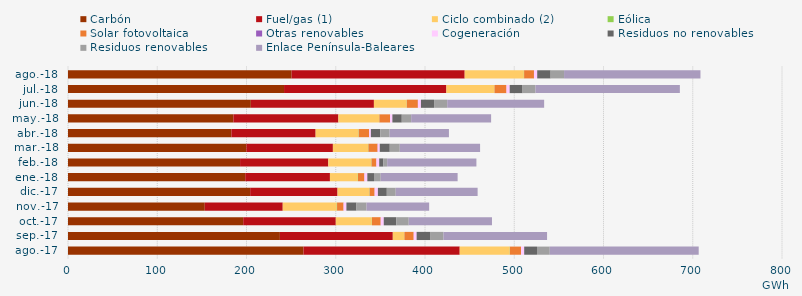
| Category | Carbón | Fuel/gas (1) | Ciclo combinado (2) | Eólica | Solar fotovoltaica | Otras renovables | Cogeneración | Residuos no renovables | Residuos renovables | Enlace Península-Baleares |
|---|---|---|---|---|---|---|---|---|---|---|
| ago.-17 | 263.832 | 175.061 | 56.052 | 0.172 | 12.457 | 0.073 | 3.488 | 14.326 | 14.326 | 166.876 |
| sep.-17 | 237.417 | 126.509 | 12.833 | 0.183 | 10.365 | 0.087 | 3.216 | 15.027 | 15.027 | 116.105 |
| oct.-17 | 196.317 | 103.725 | 40.38 | 0.195 | 9.719 | 0.106 | 3.35 | 13.983 | 13.983 | 93.286 |
| nov.-17 | 153.252 | 87.352 | 60.509 | 0.343 | 7.258 | 0.127 | 3.099 | 11.279 | 11.279 | 70.162 |
| dic.-17 | 204.111 | 97.886 | 35.554 | 0.382 | 5.557 | 0.137 | 3.6 | 9.982 | 9.982 | 91.767 |
| ene.-18 | 198.555 | 94.932 | 31.201 | 0.253 | 7.038 | 0.219 | 3.183 | 7.481 | 7.481 | 86.204 |
| feb.-18 | 192.795 | 98.852 | 48.135 | 0.324 | 5.335 | 0.166 | 3.084 | 4.456 | 4.456 | 99.993 |
| mar.-18 | 199.822 | 96.98 | 39.439 | 0.406 | 10.196 | 0.184 | 2.295 | 11.2 | 11.2 | 89.997 |
| abr.-18 | 183.056 | 94.399 | 48.047 | 0.283 | 11.477 | 0.131 | 1.982 | 10.487 | 10.487 | 66.468 |
| may.-18 | 185.328 | 117.635 | 45.725 | 0.229 | 11.839 | 0.128 | 2.579 | 10.525 | 10.525 | 89.565 |
| jun.-18 | 204.88 | 137.881 | 36.755 | 0.139 | 12.333 | 0.11 | 3.357 | 14.709 | 14.709 | 108.624 |
| jul.-18 | 242.068 | 181.893 | 53.755 | 0.139 | 13.421 | 0.058 | 3.566 | 14.429 | 14.429 | 161.792 |
| ago.-18 | 250.573 | 193.898 | 66.33 | 0.243 | 11.023 | 0.08 | 3.575 | 15.04 | 15.04 | 152.832 |